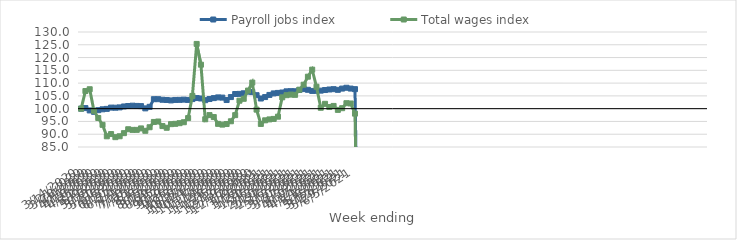
| Category | Payroll jobs index | Total wages index |
|---|---|---|
| 14/03/2020 | 100 | 100 |
| 21/03/2020 | 100.219 | 106.896 |
| 28/03/2020 | 99.311 | 107.602 |
| 04/04/2020 | 98.773 | 99.156 |
| 11/04/2020 | 99.408 | 96.352 |
| 18/04/2020 | 99.748 | 93.678 |
| 25/04/2020 | 99.917 | 89.185 |
| 02/05/2020 | 100.414 | 90.064 |
| 09/05/2020 | 100.372 | 88.848 |
| 16/05/2020 | 100.499 | 89.203 |
| 23/05/2020 | 100.866 | 90.421 |
| 30/05/2020 | 101.039 | 91.95 |
| 06/06/2020 | 101.169 | 91.697 |
| 13/06/2020 | 101.072 | 91.706 |
| 20/06/2020 | 101.004 | 92.273 |
| 27/06/2020 | 100.116 | 91.343 |
| 04/07/2020 | 100.72 | 92.733 |
| 11/07/2020 | 103.715 | 94.804 |
| 18/07/2020 | 103.713 | 94.975 |
| 25/07/2020 | 103.489 | 93.189 |
| 01/08/2020 | 103.395 | 92.523 |
| 08/08/2020 | 103.232 | 93.941 |
| 15/08/2020 | 103.412 | 94.066 |
| 22/08/2020 | 103.444 | 94.324 |
| 29/08/2020 | 103.533 | 94.691 |
| 05/09/2020 | 103.421 | 96.311 |
| 12/09/2020 | 103.748 | 104.984 |
| 19/09/2020 | 104.155 | 125.334 |
| 26/09/2020 | 103.98 | 117.213 |
| 03/10/2020 | 103.318 | 95.849 |
| 10/10/2020 | 103.772 | 97.482 |
| 17/10/2020 | 104.134 | 96.715 |
| 24/10/2020 | 104.407 | 94.05 |
| 31/10/2020 | 104.331 | 93.758 |
| 07/11/2020 | 103.384 | 93.989 |
| 14/11/2020 | 104.54 | 95.069 |
| 21/11/2020 | 105.735 | 97.469 |
| 28/11/2020 | 105.786 | 103.123 |
| 05/12/2020 | 106.016 | 103.859 |
| 12/12/2020 | 106.66 | 107.078 |
| 19/12/2020 | 106.488 | 110.204 |
| 26/12/2020 | 105.28 | 99.626 |
| 02/01/2021 | 103.969 | 94.024 |
| 09/01/2021 | 104.536 | 95.44 |
| 16/01/2021 | 105.375 | 95.799 |
| 23/01/2021 | 105.968 | 95.989 |
| 30/01/2021 | 106.167 | 96.867 |
| 06/02/2021 | 106.33 | 104.434 |
| 13/02/2021 | 106.78 | 105.277 |
| 20/02/2021 | 106.848 | 105.505 |
| 27/02/2021 | 106.817 | 105.411 |
| 06/03/2021 | 107.315 | 107.415 |
| 13/03/2021 | 107.66 | 109.376 |
| 20/03/2021 | 107.383 | 112.518 |
| 27/03/2021 | 106.94 | 115.272 |
| 03/04/2021 | 106.974 | 108.586 |
| 10/04/2021 | 107.057 | 100.354 |
| 17/04/2021 | 107.297 | 101.902 |
| 24/04/2021 | 107.501 | 100.641 |
| 01/05/2021 | 107.634 | 101.073 |
| 08/05/2021 | 107.366 | 99.525 |
| 15/05/2021 | 107.857 | 100.183 |
| 22/05/2021 | 108.18 | 102.139 |
| 29/05/2021 | 107.866 | 102.031 |
| 05/06/2021 | 107.635 | 98.054 |